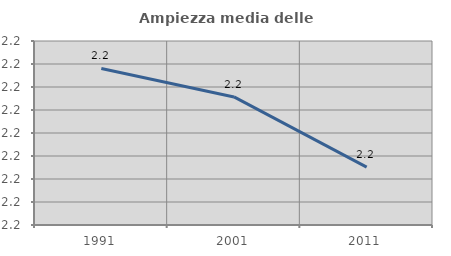
| Category | Ampiezza media delle famiglie |
|---|---|
| 1991.0 | 2.228 |
| 2001.0 | 2.216 |
| 2011.0 | 2.185 |